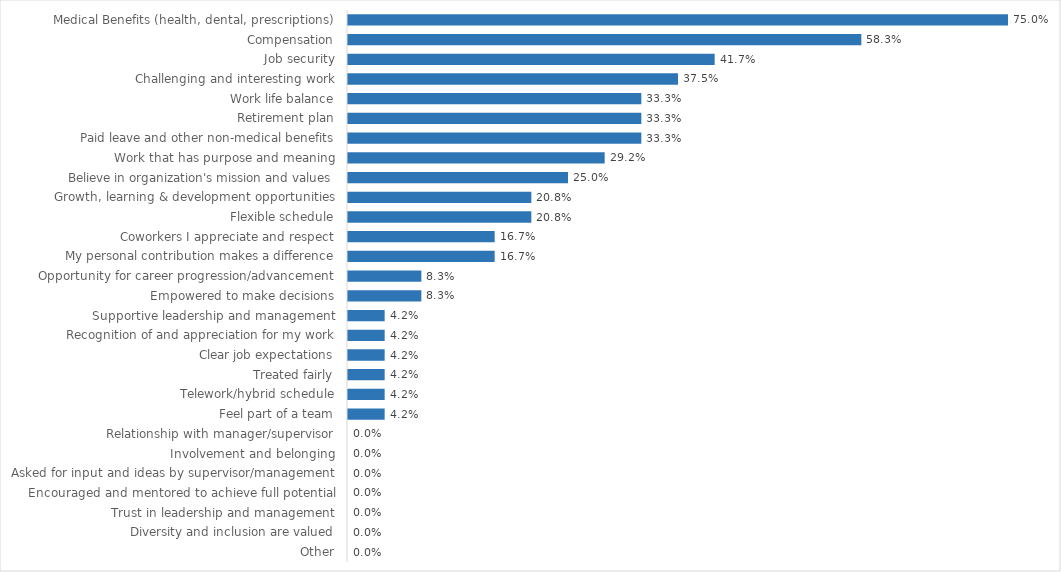
| Category | Defender General |
|---|---|
| Medical Benefits (health, dental, prescriptions) | 0.75 |
| Compensation | 0.583 |
| Job security | 0.417 |
| Challenging and interesting work | 0.375 |
| Work life balance | 0.333 |
| Retirement plan | 0.333 |
| Paid leave and other non-medical benefits | 0.333 |
| Work that has purpose and meaning | 0.292 |
| Believe in organization's mission and values | 0.25 |
| Growth, learning & development opportunities | 0.208 |
| Flexible schedule | 0.208 |
| Coworkers I appreciate and respect | 0.167 |
| My personal contribution makes a difference | 0.167 |
| Opportunity for career progression/advancement | 0.083 |
| Empowered to make decisions | 0.083 |
| Supportive leadership and management | 0.042 |
| Recognition of and appreciation for my work | 0.042 |
| Clear job expectations | 0.042 |
| Treated fairly | 0.042 |
| Telework/hybrid schedule | 0.042 |
| Feel part of a team | 0.042 |
| Relationship with manager/supervisor | 0 |
| Involvement and belonging | 0 |
| Asked for input and ideas by supervisor/management | 0 |
| Encouraged and mentored to achieve full potential | 0 |
| Trust in leadership and management | 0 |
| Diversity and inclusion are valued | 0 |
| Other | 0 |